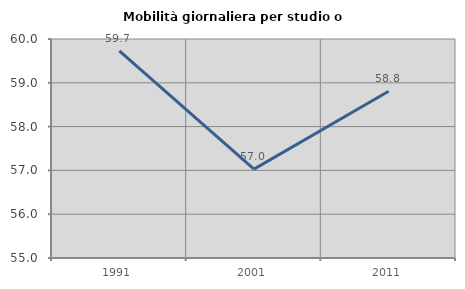
| Category | Mobilità giornaliera per studio o lavoro |
|---|---|
| 1991.0 | 59.727 |
| 2001.0 | 57.03 |
| 2011.0 | 58.807 |